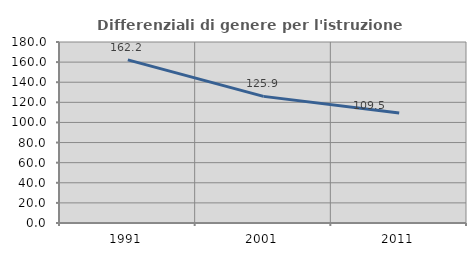
| Category | Differenziali di genere per l'istruzione superiore |
|---|---|
| 1991.0 | 162.198 |
| 2001.0 | 125.934 |
| 2011.0 | 109.502 |